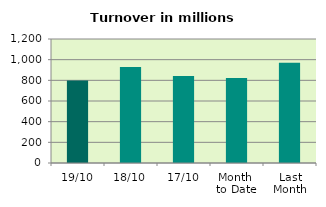
| Category | Series 0 |
|---|---|
| 19/10 | 799.241 |
| 18/10 | 928.216 |
| 17/10 | 841.91 |
| Month 
to Date | 821.658 |
| Last
Month | 970.98 |